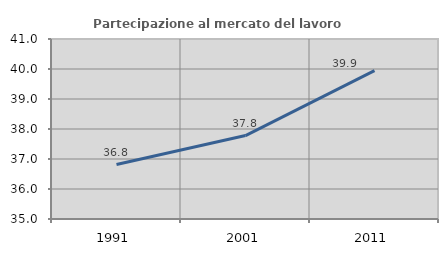
| Category | Partecipazione al mercato del lavoro  femminile |
|---|---|
| 1991.0 | 36.817 |
| 2001.0 | 37.782 |
| 2011.0 | 39.944 |